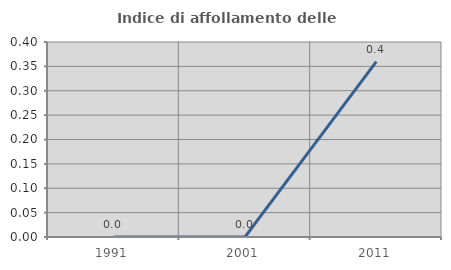
| Category | Indice di affollamento delle abitazioni  |
|---|---|
| 1991.0 | 0 |
| 2001.0 | 0 |
| 2011.0 | 0.36 |